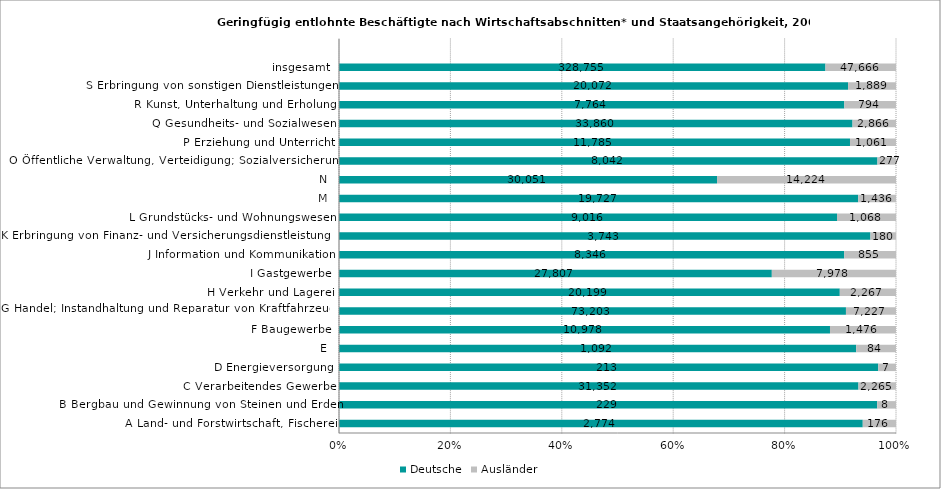
| Category | Deutsche | Ausländer |
|---|---|---|
| A Land- und Forstwirtschaft, Fischerei | 2774 | 176 |
| B Bergbau und Gewinnung von Steinen und Erden | 229 | 8 |
| C Verarbeitendes Gewerbe | 31352 | 2265 |
| D Energieversorgung | 213 | 7 |
| E | 1092 | 84 |
| F Baugewerbe | 10978 | 1476 |
| G Handel; Instandhaltung und Reparatur von Kraftfahrzeugen | 73203 | 7227 |
| H Verkehr und Lagerei | 20199 | 2267 |
| I Gastgewerbe | 27807 | 7978 |
| J Information und Kommunikation | 8346 | 855 |
| K Erbringung von Finanz- und Versicherungsdienstleistungen | 3743 | 180 |
| L Grundstücks- und Wohnungswesen | 9016 | 1068 |
| M | 19727 | 1436 |
| N | 30051 | 14224 |
| O Öffentliche Verwaltung, Verteidigung; Sozialversicherung | 8042 | 277 |
| P Erziehung und Unterricht | 11785 | 1061 |
| Q Gesundheits- und Sozialwesen | 33860 | 2866 |
| R Kunst, Unterhaltung und Erholung | 7764 | 794 |
| S Erbringung von sonstigen Dienstleistungen | 20072 | 1889 |
| insgesamt | 328755 | 47666 |